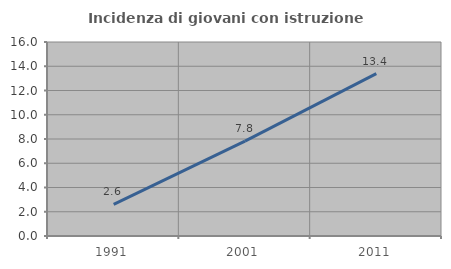
| Category | Incidenza di giovani con istruzione universitaria |
|---|---|
| 1991.0 | 2.614 |
| 2001.0 | 7.831 |
| 2011.0 | 13.386 |